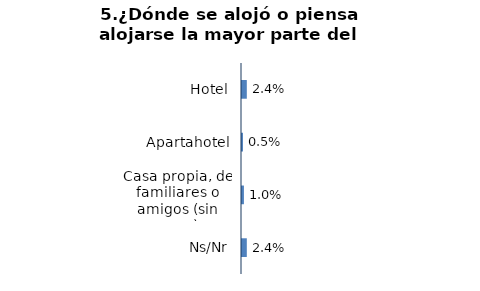
| Category | Series 0 |
|---|---|
| Hotel | 0.024 |
| Apartahotel | 0.005 |
| Casa propia, de familiares o amigos (sin pago) | 0.01 |
| Ns/Nr | 0.024 |